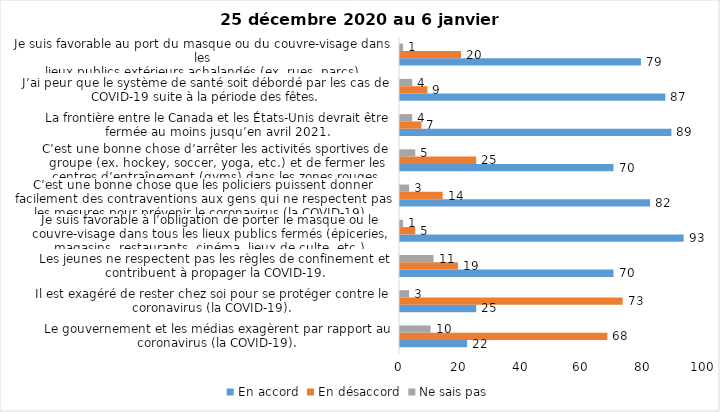
| Category | En accord | En désaccord | Ne sais pas |
|---|---|---|---|
| Le gouvernement et les médias exagèrent par rapport au coronavirus (la COVID-19). | 22 | 68 | 10 |
| Il est exagéré de rester chez soi pour se protéger contre le coronavirus (la COVID-19). | 25 | 73 | 3 |
| Les jeunes ne respectent pas les règles de confinement et contribuent à propager la COVID-19. | 70 | 19 | 11 |
| Je suis favorable à l’obligation de porter le masque ou le couvre-visage dans tous les lieux publics fermés (épiceries, magasins, restaurants, cinéma, lieux de culte, etc.). | 93 | 5 | 1 |
| C’est une bonne chose que les policiers puissent donner facilement des contraventions aux gens qui ne respectent pas les mesures pour prévenir le coronavirus (la COVID-19). | 82 | 14 | 3 |
| C’est une bonne chose d’arrêter les activités sportives de groupe (ex. hockey, soccer, yoga, etc.) et de fermer les centres d’entraînement (gyms) dans les zones rouges. | 70 | 25 | 5 |
| La frontière entre le Canada et les États-Unis devrait être fermée au moins jusqu’en avril 2021. | 89 | 7 | 4 |
| J’ai peur que le système de santé soit débordé par les cas de COVID-19 suite à la période des fêtes. | 87 | 9 | 4 |
| Je suis favorable au port du masque ou du couvre-visage dans les
lieux publics extérieurs achalandés (ex. rues, parcs) | 79 | 20 | 1 |